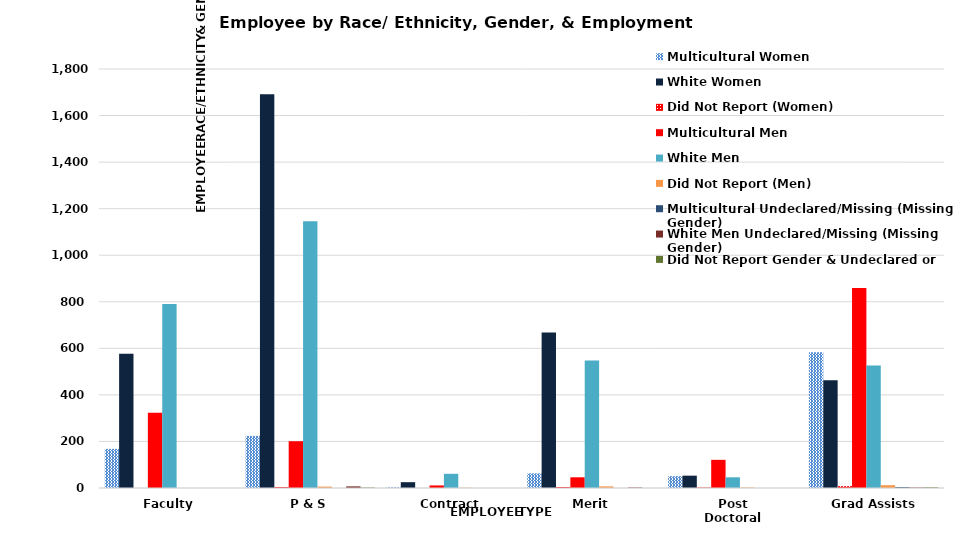
| Category | Multicultural Women | White Women | Did Not Report (Women) | Multicultural Men | White Men | Did Not Report (Men) | Multicultural Undeclared/Missing (Missing Gender) | White Men Undeclared/Missing (Missing Gender) | Did Not Report Gender & Undeclared or Missing Race/Ethnicity |
|---|---|---|---|---|---|---|---|---|---|
| Faculty | 168 | 577 | 0 | 323 | 790 | 0 | 0 | 0 | 0 |
| P & S | 224 | 1691 | 4 | 201 | 1146 | 6 | 0 | 7 | 2 |
| Contract | 3 | 25 | 0 | 11 | 61 | 1 | 0 | 0 | 0 |
| Merit | 63 | 668 | 4 | 46 | 548 | 7 | 0 | 2 | 0 |
| Post Doctoral | 51 | 53 | 2 | 121 | 46 | 2 | 0 | 0 | 0 |
| Grad Assists | 583 | 463 | 8 | 859 | 526 | 12 | 4 | 2 | 3 |